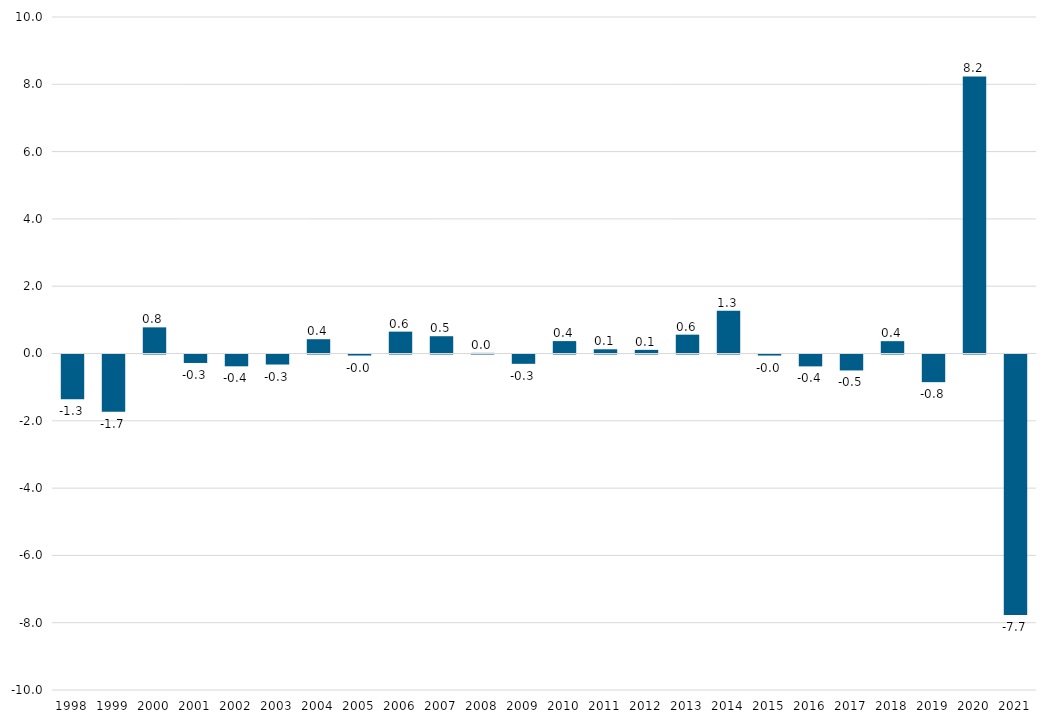
| Category | Impulso Fiscal Ajustado |
|---|---|
| 1998.0 | -1.332 |
| 1999.0 | -1.7 |
| 2000.0 | 0.777 |
| 2001.0 | -0.252 |
| 2002.0 | -0.351 |
| 2003.0 | -0.298 |
| 2004.0 | 0.425 |
| 2005.0 | -0.031 |
| 2006.0 | 0.65 |
| 2007.0 | 0.513 |
| 2008.0 | 0.018 |
| 2009.0 | -0.277 |
| 2010.0 | 0.368 |
| 2011.0 | 0.125 |
| 2012.0 | 0.108 |
| 2013.0 | 0.56 |
| 2014.0 | 1.272 |
| 2015.0 | -0.032 |
| 2016.0 | -0.353 |
| 2017.0 | -0.474 |
| 2018.0 | 0.367 |
| 2019.0 | -0.822 |
| 2020.0 | 8.234 |
| 2021.0 | -7.742 |